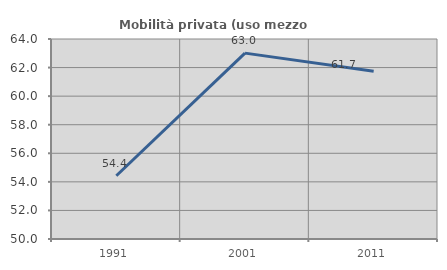
| Category | Mobilità privata (uso mezzo privato) |
|---|---|
| 1991.0 | 54.43 |
| 2001.0 | 63.011 |
| 2011.0 | 61.737 |